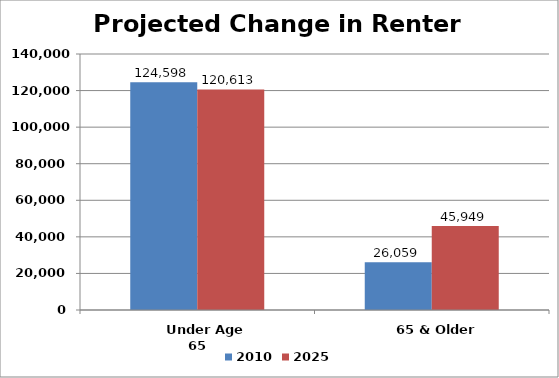
| Category | 2010 | 2025 |
|---|---|---|
|    Under Age 65 | 124598 | 120613.135 |
|    65 & Older | 26059 | 45948.733 |